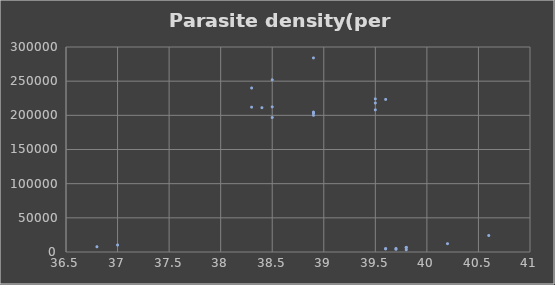
| Category | Parasite density(per µL) |
|---|---|
| 39.8 | 3320 |
| 39.7 | 3840 |
| 39.6 | 4480 |
| 39.6 | 5000 |
| 39.7 | 5120 |
| 39.8 | 6440 |
| 39.8 | 6840 |
| 36.8 | 7680 |
| 37.0 | 10240 |
| 40.2 | 12160 |
| 40.6 | 24160 |
| 38.5 | 196800 |
| 38.9 | 200000 |
| 38.9 | 203200 |
| 38.9 | 203360 |
| 38.9 | 204800 |
| 39.5 | 208000 |
| 38.4 | 211200 |
| 38.3 | 212000 |
| 38.5 | 212400 |
| 39.5 | 218000 |
| 39.6 | 223328 |
| 39.5 | 224080 |
| 38.3 | 240000 |
| 38.5 | 252000 |
| 38.9 | 284000 |